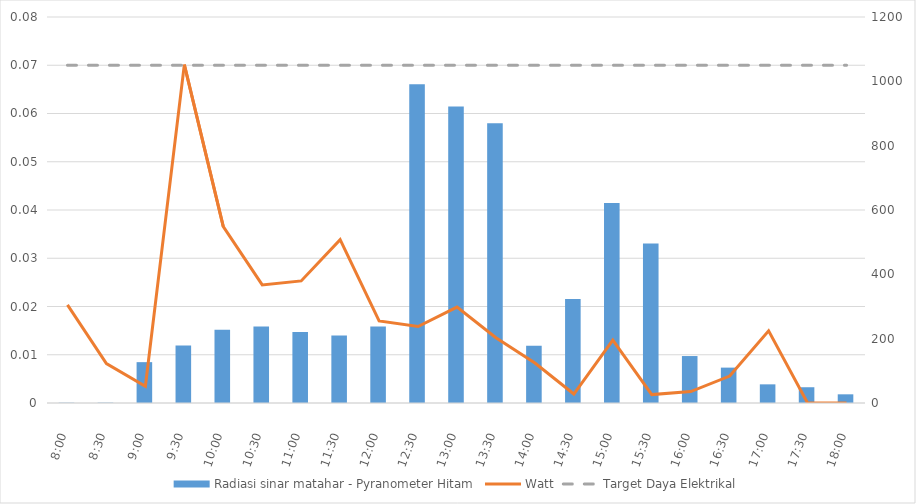
| Category | Radiasi sinar matahar - Pyranometer Hitam |
|---|---|
| 2019-04-13 08:00:00 | 0.77 |
| 304976.3541666666 | 0.97 |
| 566384.3750000001 | 127 |
| 827792.3958333336 | 179 |
| 1089200.416666667 | 228 |
| 1350608.4375000005 | 238 |
| 1612016.458333334 | 221 |
| 1873424.4791666674 | 210 |
| 2134832.500000001 | 238 |
| 2396240.520833333 | 991 |
| 2657648.541666665 | 922 |
| 2919056.562499997 | 870 |
| 1089200.5833333337 | 178 |
| 1350608.6041666672 | 323 |
| 1612016.6250000007 | 622 |
| 1873424.6458333342 | 496 |
| 2134832.6666666674 | 146 |
| 2396240.6874999995 | 110 |
| 2657648.7083333316 | 58 |
| 2919056.7291666637 | 49 |
| 1089200.7500000005 | 27 |